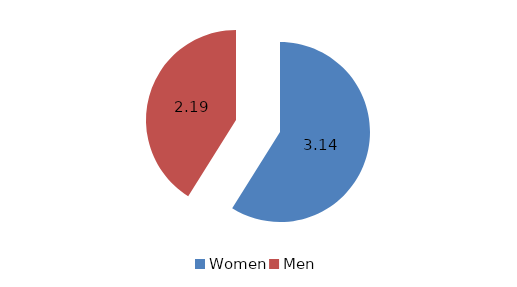
| Category | Series 0 |
|---|---|
| Women | 3.14 |
| Men | 2.19 |